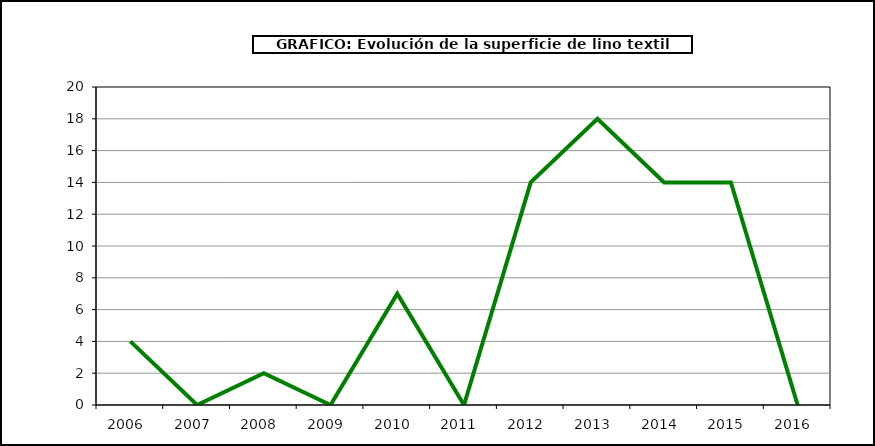
| Category | Superficie |
|---|---|
| 2006.0 | 4 |
| 2007.0 | 0 |
| 2008.0 | 2 |
| 2009.0 | 0 |
| 2010.0 | 7 |
| 2011.0 | 0 |
| 2012.0 | 14 |
| 2013.0 | 18 |
| 2014.0 | 14 |
| 2015.0 | 14 |
| 2016.0 | 0 |